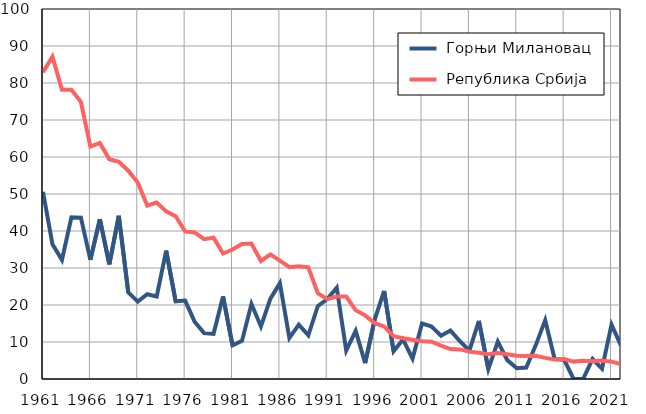
| Category |  Горњи Милановац |  Република Србија |
|---|---|---|
| 1961.0 | 50.6 | 82.9 |
| 1962.0 | 36.4 | 87.1 |
| 1963.0 | 32.2 | 78.2 |
| 1964.0 | 43.7 | 78.2 |
| 1965.0 | 43.6 | 74.9 |
| 1966.0 | 32.2 | 62.8 |
| 1967.0 | 43.2 | 63.8 |
| 1968.0 | 31 | 59.4 |
| 1969.0 | 44.1 | 58.7 |
| 1970.0 | 23.4 | 56.3 |
| 1971.0 | 20.9 | 53.1 |
| 1972.0 | 22.9 | 46.9 |
| 1973.0 | 22.3 | 47.7 |
| 1974.0 | 34.7 | 45.3 |
| 1975.0 | 21 | 44 |
| 1976.0 | 21.2 | 39.9 |
| 1977.0 | 15.5 | 39.6 |
| 1978.0 | 12.4 | 37.8 |
| 1979.0 | 12.2 | 38.2 |
| 1980.0 | 22.3 | 33.9 |
| 1981.0 | 9.1 | 35 |
| 1982.0 | 10.3 | 36.5 |
| 1983.0 | 20.3 | 36.6 |
| 1984.0 | 14.2 | 31.9 |
| 1985.0 | 21.7 | 33.7 |
| 1986.0 | 25.9 | 32 |
| 1987.0 | 11.1 | 30.2 |
| 1988.0 | 14.7 | 30.5 |
| 1989.0 | 11.8 | 30.2 |
| 1990.0 | 19.7 | 23.2 |
| 1991.0 | 21.6 | 21.6 |
| 1992.0 | 24.7 | 22.3 |
| 1993.0 | 7.7 | 22.3 |
| 1994.0 | 13 | 18.6 |
| 1995.0 | 4.3 | 17.2 |
| 1996.0 | 16 | 15.1 |
| 1997.0 | 23.8 | 14.2 |
| 1998.0 | 7.5 | 11.6 |
| 1999.0 | 10.7 | 11 |
| 2000.0 | 5.5 | 10.6 |
| 2001.0 | 15 | 10.2 |
| 2002.0 | 14.2 | 10.1 |
| 2003.0 | 11.7 | 9 |
| 2004.0 | 13.1 | 8.1 |
| 2005.0 | 10.2 | 8 |
| 2006.0 | 7.7 | 7.4 |
| 2007.0 | 15.7 | 7.1 |
| 2008.0 | 2.7 | 6.7 |
| 2009.0 | 10.1 | 7 |
| 2010.0 | 5.1 | 6.7 |
| 2011.0 | 2.9 | 6.3 |
| 2012.0 | 3.1 | 6.2 |
| 2013.0 | 9.1 | 6.3 |
| 2014.0 | 15.9 | 5.7 |
| 2015.0 | 5.4 | 5.3 |
| 2016.0 | 5.2 | 5.4 |
| 2017.0 | 0 | 4.7 |
| 2018.0 | 0 | 4.9 |
| 2019.0 | 5.4 | 4.8 |
| 2020.0 | 2.8 | 5 |
| 2021.0 | 14.7 | 4.7 |
| 2022.0 | 9 | 4 |